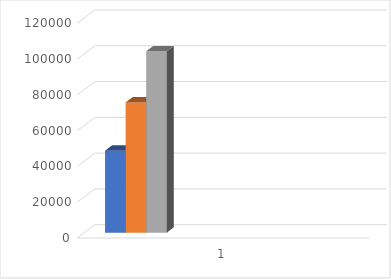
| Category | January | Feb | March | April | May | June | July | Aug | Sept | Oct | Nov | Dec |
|---|---|---|---|---|---|---|---|---|---|---|---|---|
| 0 | 45830.5 | 72811.39 | 101384.5 |  |  |  |  |  |  |  |  |  |